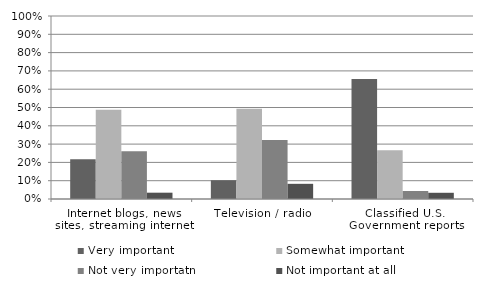
| Category | Very important | Somewhat important | Not very importatn | Not important at all |
|---|---|---|---|---|
| Internet blogs, news sites, streaming internet | 0.217 | 0.488 | 0.261 | 0.034 |
| Television / radio | 0.102 | 0.493 | 0.322 | 0.083 |
| Classified U.S. Government reports | 0.655 | 0.267 | 0.044 | 0.034 |